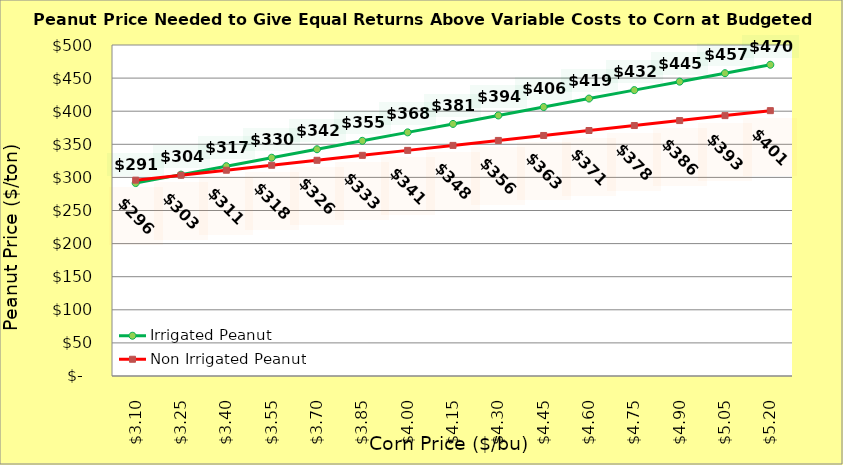
| Category | Irrigated Peanut | Non Irrigated Peanut |
|---|---|---|
| 3.1000000000000005 | 291.436 | 295.836 |
| 3.2500000000000004 | 304.202 | 303.336 |
| 3.4000000000000004 | 316.968 | 310.836 |
| 3.5500000000000003 | 329.734 | 318.336 |
| 3.7 | 342.5 | 325.836 |
| 3.85 | 355.266 | 333.336 |
| 4.0 | 368.032 | 340.836 |
| 4.15 | 380.798 | 348.336 |
| 4.300000000000001 | 393.564 | 355.836 |
| 4.450000000000001 | 406.33 | 363.336 |
| 4.600000000000001 | 419.096 | 370.836 |
| 4.750000000000002 | 431.862 | 378.336 |
| 4.900000000000002 | 444.627 | 385.836 |
| 5.0500000000000025 | 457.393 | 393.336 |
| 5.200000000000003 | 470.159 | 400.836 |